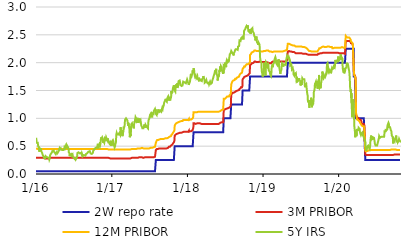
| Category | 2W repo rate | 3M PRIBOR | 12M PRIBOR | 5Y IRS |
|---|---|---|---|---|
| 2016-01-04 | 0.05 | 0.29 | 0.46 | 0.65 |
| 2016-01-05 | 0.05 | 0.29 | 0.46 | 0.63 |
| 2016-01-06 | 0.05 | 0.29 | 0.46 | 0.62 |
| 2016-01-07 | 0.05 | 0.29 | 0.46 | 0.56 |
| 2016-01-08 | 0.05 | 0.29 | 0.46 | 0.57 |
| 2016-01-11 | 0.05 | 0.29 | 0.45 | 0.56 |
| 2016-01-12 | 0.05 | 0.29 | 0.45 | 0.56 |
| 2016-01-13 | 0.05 | 0.29 | 0.45 | 0.56 |
| 2016-01-14 | 0.05 | 0.29 | 0.45 | 0.5 |
| 2016-01-15 | 0.05 | 0.29 | 0.45 | 0.49 |
| 2016-01-18 | 0.05 | 0.29 | 0.45 | 0.46 |
| 2016-01-19 | 0.05 | 0.29 | 0.45 | 0.46 |
| 2016-01-20 | 0.05 | 0.29 | 0.45 | 0.4 |
| 2016-01-21 | 0.05 | 0.29 | 0.45 | 0.43 |
| 2016-01-22 | 0.05 | 0.29 | 0.45 | 0.46 |
| 2016-01-25 | 0.05 | 0.29 | 0.45 | 0.45 |
| 2016-01-26 | 0.05 | 0.29 | 0.45 | 0.44 |
| 2016-01-27 | 0.05 | 0.29 | 0.45 | 0.46 |
| 2016-01-28 | 0.05 | 0.29 | 0.45 | 0.44 |
| 2016-01-29 | 0.05 | 0.29 | 0.45 | 0.41 |
| 2016-02-01 | 0.05 | 0.29 | 0.45 | 0.4 |
| 2016-02-02 | 0.05 | 0.29 | 0.45 | 0.38 |
| 2016-02-03 | 0.05 | 0.29 | 0.45 | 0.37 |
| 2016-02-04 | 0.05 | 0.29 | 0.45 | 0.37 |
| 2016-02-05 | 0.05 | 0.29 | 0.45 | 0.34 |
| 2016-02-08 | 0.05 | 0.29 | 0.45 | 0.32 |
| 2016-02-09 | 0.05 | 0.28 | 0.45 | 0.31 |
| 2016-02-10 | 0.05 | 0.28 | 0.45 | 0.31 |
| 2016-02-11 | 0.05 | 0.28 | 0.45 | 0.29 |
| 2016-02-12 | 0.05 | 0.28 | 0.45 | 0.28 |
| 2016-02-15 | 0.05 | 0.28 | 0.45 | 0.28 |
| 2016-02-16 | 0.05 | 0.28 | 0.45 | 0.28 |
| 2016-02-17 | 0.05 | 0.28 | 0.45 | 0.28 |
| 2016-02-18 | 0.05 | 0.28 | 0.45 | 0.3 |
| 2016-02-19 | 0.05 | 0.28 | 0.45 | 0.32 |
| 2016-02-22 | 0.05 | 0.28 | 0.45 | 0.32 |
| 2016-02-23 | 0.05 | 0.28 | 0.45 | 0.32 |
| 2016-02-24 | 0.05 | 0.28 | 0.45 | 0.3 |
| 2016-02-25 | 0.05 | 0.28 | 0.45 | 0.3 |
| 2016-02-26 | 0.05 | 0.28 | 0.45 | 0.31 |
| 2016-02-29 | 0.05 | 0.28 | 0.45 | 0.3 |
| 2016-03-01 | 0.05 | 0.28 | 0.45 | 0.29 |
| 2016-03-02 | 0.05 | 0.28 | 0.45 | 0.31 |
| 2016-03-03 | 0.05 | 0.28 | 0.45 | 0.3 |
| 2016-03-04 | 0.05 | 0.28 | 0.45 | 0.29 |
| 2016-03-07 | 0.05 | 0.28 | 0.45 | 0.28 |
| 2016-03-08 | 0.05 | 0.28 | 0.45 | 0.26 |
| 2016-03-09 | 0.05 | 0.28 | 0.45 | 0.26 |
| 2016-03-10 | 0.05 | 0.28 | 0.45 | 0.28 |
| 2016-03-11 | 0.05 | 0.29 | 0.45 | 0.33 |
| 2016-03-14 | 0.05 | 0.29 | 0.45 | 0.34 |
| 2016-03-15 | 0.05 | 0.29 | 0.45 | 0.36 |
| 2016-03-16 | 0.05 | 0.29 | 0.45 | 0.37 |
| 2016-03-17 | 0.05 | 0.29 | 0.45 | 0.37 |
| 2016-03-18 | 0.05 | 0.29 | 0.45 | 0.37 |
| 2016-03-21 | 0.05 | 0.29 | 0.45 | 0.39 |
| 2016-03-22 | 0.05 | 0.29 | 0.45 | 0.41 |
| 2016-03-23 | 0.05 | 0.29 | 0.45 | 0.41 |
| 2016-03-24 | 0.05 | 0.29 | 0.45 | 0.4 |
| 2016-03-29 | 0.05 | 0.29 | 0.45 | 0.42 |
| 2016-03-30 | 0.05 | 0.29 | 0.45 | 0.4 |
| 2016-03-31 | 0.05 | 0.29 | 0.45 | 0.4 |
| 2016-04-01 | 0.05 | 0.29 | 0.45 | 0.4 |
| 2016-04-04 | 0.05 | 0.29 | 0.45 | 0.38 |
| 2016-04-05 | 0.05 | 0.29 | 0.45 | 0.37 |
| 2016-04-06 | 0.05 | 0.29 | 0.45 | 0.38 |
| 2016-04-07 | 0.05 | 0.29 | 0.45 | 0.36 |
| 2016-04-08 | 0.05 | 0.29 | 0.45 | 0.36 |
| 2016-04-11 | 0.05 | 0.29 | 0.45 | 0.35 |
| 2016-04-12 | 0.05 | 0.29 | 0.45 | 0.39 |
| 2016-04-13 | 0.05 | 0.29 | 0.45 | 0.37 |
| 2016-04-14 | 0.05 | 0.29 | 0.45 | 0.39 |
| 2016-04-15 | 0.05 | 0.29 | 0.45 | 0.37 |
| 2016-04-18 | 0.05 | 0.29 | 0.45 | 0.37 |
| 2016-04-19 | 0.05 | 0.29 | 0.45 | 0.39 |
| 2016-04-20 | 0.05 | 0.29 | 0.45 | 0.38 |
| 2016-04-21 | 0.05 | 0.29 | 0.45 | 0.41 |
| 2016-04-22 | 0.05 | 0.29 | 0.45 | 0.41 |
| 2016-04-25 | 0.05 | 0.29 | 0.45 | 0.42 |
| 2016-04-26 | 0.05 | 0.29 | 0.45 | 0.46 |
| 2016-04-27 | 0.05 | 0.29 | 0.45 | 0.46 |
| 2016-04-28 | 0.05 | 0.29 | 0.45 | 0.44 |
| 2016-04-29 | 0.05 | 0.29 | 0.45 | 0.45 |
| 2016-05-02 | 0.05 | 0.29 | 0.45 | 0.46 |
| 2016-05-03 | 0.05 | 0.29 | 0.45 | 0.46 |
| 2016-05-04 | 0.05 | 0.29 | 0.45 | 0.44 |
| 2016-05-05 | 0.05 | 0.29 | 0.45 | 0.45 |
| 2016-05-06 | 0.05 | 0.29 | 0.45 | 0.44 |
| 2016-05-09 | 0.05 | 0.29 | 0.45 | 0.43 |
| 2016-05-10 | 0.05 | 0.29 | 0.45 | 0.44 |
| 2016-05-11 | 0.05 | 0.29 | 0.45 | 0.43 |
| 2016-05-12 | 0.05 | 0.29 | 0.45 | 0.42 |
| 2016-05-13 | 0.05 | 0.29 | 0.45 | 0.43 |
| 2016-05-16 | 0.05 | 0.29 | 0.45 | 0.43 |
| 2016-05-17 | 0.05 | 0.29 | 0.45 | 0.44 |
| 2016-05-18 | 0.05 | 0.29 | 0.45 | 0.44 |
| 2016-05-19 | 0.05 | 0.29 | 0.45 | 0.46 |
| 2016-05-20 | 0.05 | 0.29 | 0.45 | 0.48 |
| 2016-05-23 | 0.05 | 0.29 | 0.45 | 0.46 |
| 2016-05-24 | 0.05 | 0.29 | 0.45 | 0.46 |
| 2016-05-25 | 0.05 | 0.29 | 0.45 | 0.48 |
| 2016-05-26 | 0.05 | 0.29 | 0.45 | 0.48 |
| 2016-05-27 | 0.05 | 0.29 | 0.45 | 0.51 |
| 2016-05-30 | 0.05 | 0.29 | 0.45 | 0.49 |
| 2016-05-31 | 0.05 | 0.29 | 0.45 | 0.52 |
| 2016-06-01 | 0.05 | 0.29 | 0.45 | 0.51 |
| 2016-06-02 | 0.05 | 0.29 | 0.45 | 0.51 |
| 2016-06-03 | 0.05 | 0.29 | 0.45 | 0.51 |
| 2016-06-06 | 0.05 | 0.29 | 0.45 | 0.48 |
| 2016-06-07 | 0.05 | 0.29 | 0.45 | 0.49 |
| 2016-06-08 | 0.05 | 0.29 | 0.45 | 0.47 |
| 2016-06-09 | 0.05 | 0.29 | 0.45 | 0.45 |
| 2016-06-10 | 0.05 | 0.29 | 0.45 | 0.39 |
| 2016-06-13 | 0.05 | 0.29 | 0.45 | 0.37 |
| 2016-06-14 | 0.05 | 0.29 | 0.45 | 0.32 |
| 2016-06-15 | 0.05 | 0.29 | 0.45 | 0.32 |
| 2016-06-16 | 0.05 | 0.29 | 0.45 | 0.32 |
| 2016-06-17 | 0.05 | 0.29 | 0.45 | 0.35 |
| 2016-06-20 | 0.05 | 0.29 | 0.45 | 0.35 |
| 2016-06-21 | 0.05 | 0.29 | 0.45 | 0.36 |
| 2016-06-22 | 0.05 | 0.29 | 0.45 | 0.36 |
| 2016-06-23 | 0.05 | 0.29 | 0.45 | 0.36 |
| 2016-06-24 | 0.05 | 0.29 | 0.45 | 0.33 |
| 2016-06-27 | 0.05 | 0.29 | 0.45 | 0.32 |
| 2016-06-28 | 0.05 | 0.29 | 0.45 | 0.35 |
| 2016-06-29 | 0.05 | 0.29 | 0.45 | 0.33 |
| 2016-06-30 | 0.05 | 0.29 | 0.45 | 0.31 |
| 2016-07-01 | 0.05 | 0.29 | 0.45 | 0.31 |
| 2016-07-04 | 0.05 | 0.29 | 0.45 | 0.29 |
| 2016-07-07 | 0.05 | 0.29 | 0.45 | 0.28 |
| 2016-07-08 | 0.05 | 0.29 | 0.45 | 0.28 |
| 2016-07-11 | 0.05 | 0.29 | 0.45 | 0.26 |
| 2016-07-12 | 0.05 | 0.29 | 0.45 | 0.3 |
| 2016-07-13 | 0.05 | 0.29 | 0.45 | 0.29 |
| 2016-07-14 | 0.05 | 0.29 | 0.45 | 0.27 |
| 2016-07-15 | 0.05 | 0.29 | 0.45 | 0.28 |
| 2016-07-18 | 0.05 | 0.29 | 0.45 | 0.29 |
| 2016-07-19 | 0.05 | 0.29 | 0.45 | 0.28 |
| 2016-07-20 | 0.05 | 0.29 | 0.45 | 0.32 |
| 2016-07-21 | 0.05 | 0.29 | 0.45 | 0.36 |
| 2016-07-22 | 0.05 | 0.29 | 0.45 | 0.38 |
| 2016-07-25 | 0.05 | 0.29 | 0.45 | 0.38 |
| 2016-07-26 | 0.05 | 0.29 | 0.45 | 0.38 |
| 2016-07-27 | 0.05 | 0.29 | 0.45 | 0.39 |
| 2016-07-28 | 0.05 | 0.29 | 0.45 | 0.38 |
| 2016-07-29 | 0.05 | 0.29 | 0.45 | 0.38 |
| 2016-08-01 | 0.05 | 0.29 | 0.45 | 0.37 |
| 2016-08-02 | 0.05 | 0.29 | 0.45 | 0.37 |
| 2016-08-03 | 0.05 | 0.29 | 0.45 | 0.37 |
| 2016-08-04 | 0.05 | 0.29 | 0.45 | 0.38 |
| 2016-08-05 | 0.05 | 0.29 | 0.45 | 0.38 |
| 2016-08-08 | 0.05 | 0.29 | 0.45 | 0.38 |
| 2016-08-09 | 0.05 | 0.29 | 0.45 | 0.37 |
| 2016-08-10 | 0.05 | 0.29 | 0.45 | 0.37 |
| 2016-08-11 | 0.05 | 0.29 | 0.45 | 0.35 |
| 2016-08-12 | 0.05 | 0.29 | 0.45 | 0.37 |
| 2016-08-15 | 0.05 | 0.29 | 0.45 | 0.34 |
| 2016-08-16 | 0.05 | 0.29 | 0.45 | 0.32 |
| 2016-08-17 | 0.05 | 0.29 | 0.45 | 0.33 |
| 2016-08-18 | 0.05 | 0.29 | 0.45 | 0.33 |
| 2016-08-19 | 0.05 | 0.29 | 0.45 | 0.33 |
| 2016-08-22 | 0.05 | 0.29 | 0.45 | 0.34 |
| 2016-08-23 | 0.05 | 0.29 | 0.45 | 0.33 |
| 2016-08-24 | 0.05 | 0.29 | 0.45 | 0.33 |
| 2016-08-25 | 0.05 | 0.29 | 0.45 | 0.33 |
| 2016-08-26 | 0.05 | 0.29 | 0.45 | 0.33 |
| 2016-08-29 | 0.05 | 0.29 | 0.45 | 0.33 |
| 2016-08-30 | 0.05 | 0.29 | 0.45 | 0.33 |
| 2016-08-31 | 0.05 | 0.29 | 0.45 | 0.34 |
| 2016-09-01 | 0.05 | 0.29 | 0.45 | 0.36 |
| 2016-09-02 | 0.05 | 0.29 | 0.45 | 0.36 |
| 2016-09-05 | 0.05 | 0.29 | 0.45 | 0.37 |
| 2016-09-06 | 0.05 | 0.29 | 0.45 | 0.37 |
| 2016-09-07 | 0.05 | 0.29 | 0.45 | 0.36 |
| 2016-09-08 | 0.05 | 0.29 | 0.45 | 0.36 |
| 2016-09-09 | 0.05 | 0.29 | 0.45 | 0.38 |
| 2016-09-12 | 0.05 | 0.29 | 0.45 | 0.4 |
| 2016-09-13 | 0.05 | 0.29 | 0.45 | 0.4 |
| 2016-09-14 | 0.05 | 0.29 | 0.45 | 0.4 |
| 2016-09-15 | 0.05 | 0.29 | 0.45 | 0.41 |
| 2016-09-16 | 0.05 | 0.29 | 0.45 | 0.41 |
| 2016-09-19 | 0.05 | 0.29 | 0.45 | 0.41 |
| 2016-09-20 | 0.05 | 0.29 | 0.45 | 0.41 |
| 2016-09-21 | 0.05 | 0.29 | 0.45 | 0.39 |
| 2016-09-22 | 0.05 | 0.29 | 0.45 | 0.38 |
| 2016-09-23 | 0.05 | 0.29 | 0.45 | 0.37 |
| 2016-09-26 | 0.05 | 0.29 | 0.45 | 0.36 |
| 2016-09-27 | 0.05 | 0.29 | 0.45 | 0.36 |
| 2016-09-29 | 0.05 | 0.29 | 0.45 | 0.36 |
| 2016-09-30 | 0.05 | 0.29 | 0.45 | 0.36 |
| 2016-10-03 | 0.05 | 0.29 | 0.45 | 0.37 |
| 2016-10-04 | 0.05 | 0.29 | 0.45 | 0.38 |
| 2016-10-05 | 0.05 | 0.29 | 0.45 | 0.39 |
| 2016-10-06 | 0.05 | 0.29 | 0.45 | 0.42 |
| 2016-10-07 | 0.05 | 0.29 | 0.45 | 0.42 |
| 2016-10-10 | 0.05 | 0.29 | 0.45 | 0.43 |
| 2016-10-11 | 0.05 | 0.29 | 0.45 | 0.44 |
| 2016-10-12 | 0.05 | 0.29 | 0.45 | 0.44 |
| 2016-10-13 | 0.05 | 0.29 | 0.45 | 0.45 |
| 2016-10-14 | 0.05 | 0.29 | 0.45 | 0.45 |
| 2016-10-17 | 0.05 | 0.29 | 0.45 | 0.47 |
| 2016-10-18 | 0.05 | 0.29 | 0.45 | 0.47 |
| 2016-10-19 | 0.05 | 0.29 | 0.45 | 0.47 |
| 2016-10-20 | 0.05 | 0.29 | 0.45 | 0.48 |
| 2016-10-21 | 0.05 | 0.29 | 0.45 | 0.48 |
| 2016-10-24 | 0.05 | 0.29 | 0.45 | 0.48 |
| 2016-10-25 | 0.05 | 0.29 | 0.45 | 0.46 |
| 2016-10-26 | 0.05 | 0.29 | 0.45 | 0.48 |
| 2016-10-27 | 0.05 | 0.29 | 0.45 | 0.53 |
| 2016-10-31 | 0.05 | 0.29 | 0.45 | 0.54 |
| 2016-11-01 | 0.05 | 0.29 | 0.45 | 0.53 |
| 2016-11-02 | 0.05 | 0.29 | 0.45 | 0.51 |
| 2016-11-03 | 0.05 | 0.29 | 0.45 | 0.52 |
| 2016-11-04 | 0.05 | 0.29 | 0.45 | 0.53 |
| 2016-11-07 | 0.05 | 0.29 | 0.45 | 0.5 |
| 2016-11-08 | 0.05 | 0.29 | 0.45 | 0.49 |
| 2016-11-09 | 0.05 | 0.29 | 0.45 | 0.51 |
| 2016-11-10 | 0.05 | 0.29 | 0.45 | 0.55 |
| 2016-11-11 | 0.05 | 0.29 | 0.45 | 0.61 |
| 2016-11-14 | 0.05 | 0.29 | 0.45 | 0.66 |
| 2016-11-15 | 0.05 | 0.29 | 0.45 | 0.64 |
| 2016-11-16 | 0.05 | 0.29 | 0.45 | 0.65 |
| 2016-11-18 | 0.05 | 0.29 | 0.45 | 0.66 |
| 2016-11-21 | 0.05 | 0.29 | 0.45 | 0.63 |
| 2016-11-22 | 0.05 | 0.29 | 0.45 | 0.6 |
| 2016-11-23 | 0.05 | 0.29 | 0.45 | 0.56 |
| 2016-11-24 | 0.05 | 0.29 | 0.45 | 0.59 |
| 2016-11-25 | 0.05 | 0.29 | 0.45 | 0.59 |
| 2016-11-28 | 0.05 | 0.29 | 0.45 | 0.56 |
| 2016-11-29 | 0.05 | 0.29 | 0.45 | 0.56 |
| 2016-11-30 | 0.05 | 0.29 | 0.45 | 0.57 |
| 2016-12-01 | 0.05 | 0.29 | 0.45 | 0.64 |
| 2016-12-02 | 0.05 | 0.29 | 0.45 | 0.63 |
| 2016-12-05 | 0.05 | 0.29 | 0.45 | 0.62 |
| 2016-12-06 | 0.05 | 0.29 | 0.45 | 0.64 |
| 2016-12-07 | 0.05 | 0.29 | 0.45 | 0.66 |
| 2016-12-08 | 0.05 | 0.29 | 0.45 | 0.66 |
| 2016-12-09 | 0.05 | 0.29 | 0.45 | 0.64 |
| 2016-12-12 | 0.05 | 0.29 | 0.45 | 0.65 |
| 2016-12-13 | 0.05 | 0.29 | 0.45 | 0.63 |
| 2016-12-14 | 0.05 | 0.29 | 0.45 | 0.6 |
| 2016-12-15 | 0.05 | 0.29 | 0.45 | 0.64 |
| 2016-12-16 | 0.05 | 0.29 | 0.45 | 0.62 |
| 2016-12-19 | 0.05 | 0.29 | 0.44 | 0.59 |
| 2016-12-20 | 0.05 | 0.29 | 0.44 | 0.57 |
| 2016-12-21 | 0.05 | 0.29 | 0.44 | 0.56 |
| 2016-12-22 | 0.05 | 0.28 | 0.44 | 0.57 |
| 2016-12-23 | 0.05 | 0.28 | 0.44 | 0.55 |
| 2016-12-27 | 0.05 | 0.28 | 0.44 | 0.57 |
| 2016-12-28 | 0.05 | 0.27 | 0.43 | 0.54 |
| 2016-12-29 | 0.05 | 0.28 | 0.44 | 0.52 |
| 2016-12-30 | 0.05 | 0.28 | 0.44 | 0.52 |
| 2017-01-02 | 0.05 | 0.28 | 0.44 | 0.52 |
| 2017-01-03 | 0.05 | 0.28 | 0.44 | 0.52 |
| 2017-01-04 | 0.05 | 0.28 | 0.44 | 0.57 |
| 2017-01-05 | 0.05 | 0.28 | 0.44 | 0.59 |
| 2017-01-06 | 0.05 | 0.28 | 0.44 | 0.58 |
| 2017-01-09 | 0.05 | 0.28 | 0.44 | 0.61 |
| 2017-01-10 | 0.05 | 0.28 | 0.44 | 0.6 |
| 2017-01-11 | 0.05 | 0.28 | 0.44 | 0.59 |
| 2017-01-12 | 0.05 | 0.28 | 0.44 | 0.56 |
| 2017-01-13 | 0.05 | 0.28 | 0.44 | 0.52 |
| 2017-01-16 | 0.05 | 0.28 | 0.44 | 0.5 |
| 2017-01-17 | 0.05 | 0.28 | 0.44 | 0.48 |
| 2017-01-18 | 0.05 | 0.28 | 0.44 | 0.48 |
| 2017-01-19 | 0.05 | 0.28 | 0.44 | 0.5 |
| 2017-01-20 | 0.05 | 0.28 | 0.44 | 0.53 |
| 2017-01-23 | 0.05 | 0.28 | 0.44 | 0.56 |
| 2017-01-24 | 0.05 | 0.28 | 0.44 | 0.62 |
| 2017-01-25 | 0.05 | 0.28 | 0.44 | 0.7 |
| 2017-01-26 | 0.05 | 0.28 | 0.44 | 0.7 |
| 2017-01-27 | 0.05 | 0.28 | 0.44 | 0.74 |
| 2017-01-30 | 0.05 | 0.28 | 0.44 | 0.71 |
| 2017-01-31 | 0.05 | 0.28 | 0.44 | 0.71 |
| 2017-02-01 | 0.05 | 0.28 | 0.44 | 0.7 |
| 2017-02-02 | 0.05 | 0.28 | 0.44 | 0.72 |
| 2017-02-03 | 0.05 | 0.28 | 0.44 | 0.71 |
| 2017-02-06 | 0.05 | 0.28 | 0.44 | 0.71 |
| 2017-02-07 | 0.05 | 0.28 | 0.44 | 0.74 |
| 2017-02-08 | 0.05 | 0.28 | 0.44 | 0.75 |
| 2017-02-09 | 0.05 | 0.28 | 0.44 | 0.7 |
| 2017-02-10 | 0.05 | 0.28 | 0.44 | 0.72 |
| 2017-02-13 | 0.05 | 0.28 | 0.44 | 0.7 |
| 2017-02-14 | 0.05 | 0.28 | 0.44 | 0.77 |
| 2017-02-15 | 0.05 | 0.28 | 0.44 | 0.84 |
| 2017-02-16 | 0.05 | 0.28 | 0.44 | 0.83 |
| 2017-02-17 | 0.05 | 0.28 | 0.44 | 0.76 |
| 2017-02-20 | 0.05 | 0.28 | 0.44 | 0.79 |
| 2017-02-21 | 0.05 | 0.28 | 0.44 | 0.8 |
| 2017-02-22 | 0.05 | 0.28 | 0.44 | 0.78 |
| 2017-02-23 | 0.05 | 0.28 | 0.44 | 0.7 |
| 2017-02-24 | 0.05 | 0.28 | 0.44 | 0.68 |
| 2017-02-27 | 0.05 | 0.28 | 0.44 | 0.68 |
| 2017-02-28 | 0.05 | 0.28 | 0.44 | 0.77 |
| 2017-03-01 | 0.05 | 0.28 | 0.44 | 0.77 |
| 2017-03-02 | 0.05 | 0.28 | 0.44 | 0.85 |
| 2017-03-03 | 0.05 | 0.28 | 0.44 | 0.83 |
| 2017-03-06 | 0.05 | 0.28 | 0.44 | 0.86 |
| 2017-03-07 | 0.05 | 0.28 | 0.44 | 0.87 |
| 2017-03-08 | 0.05 | 0.28 | 0.44 | 0.96 |
| 2017-03-09 | 0.05 | 0.28 | 0.44 | 0.98 |
| 2017-03-10 | 0.05 | 0.28 | 0.44 | 0.99 |
| 2017-03-13 | 0.05 | 0.28 | 0.44 | 1 |
| 2017-03-14 | 0.05 | 0.28 | 0.44 | 1 |
| 2017-03-15 | 0.05 | 0.28 | 0.44 | 0.99 |
| 2017-03-16 | 0.05 | 0.28 | 0.44 | 0.99 |
| 2017-03-17 | 0.05 | 0.28 | 0.44 | 0.99 |
| 2017-03-20 | 0.05 | 0.28 | 0.44 | 0.96 |
| 2017-03-21 | 0.05 | 0.28 | 0.44 | 0.97 |
| 2017-03-22 | 0.05 | 0.28 | 0.44 | 0.9 |
| 2017-03-23 | 0.05 | 0.28 | 0.44 | 0.87 |
| 2017-03-24 | 0.05 | 0.28 | 0.44 | 0.92 |
| 2017-03-27 | 0.05 | 0.28 | 0.44 | 0.86 |
| 2017-03-28 | 0.05 | 0.28 | 0.44 | 0.84 |
| 2017-03-29 | 0.05 | 0.28 | 0.44 | 0.84 |
| 2017-03-30 | 0.05 | 0.28 | 0.44 | 0.8 |
| 2017-03-31 | 0.05 | 0.28 | 0.44 | 0.66 |
| 2017-04-03 | 0.05 | 0.28 | 0.44 | 0.71 |
| 2017-04-04 | 0.05 | 0.28 | 0.44 | 0.68 |
| 2017-04-05 | 0.05 | 0.28 | 0.44 | 0.73 |
| 2017-04-06 | 0.05 | 0.28 | 0.44 | 0.76 |
| 2017-04-07 | 0.05 | 0.29 | 0.44 | 0.89 |
| 2017-04-10 | 0.05 | 0.29 | 0.45 | 0.89 |
| 2017-04-11 | 0.05 | 0.29 | 0.45 | 0.91 |
| 2017-04-12 | 0.05 | 0.29 | 0.45 | 0.89 |
| 2017-04-13 | 0.05 | 0.29 | 0.45 | 0.88 |
| 2017-04-18 | 0.05 | 0.29 | 0.45 | 0.85 |
| 2017-04-19 | 0.05 | 0.29 | 0.45 | 0.82 |
| 2017-04-20 | 0.05 | 0.29 | 0.45 | 0.87 |
| 2017-04-21 | 0.05 | 0.29 | 0.45 | 0.88 |
| 2017-04-24 | 0.05 | 0.29 | 0.45 | 0.95 |
| 2017-04-25 | 0.05 | 0.29 | 0.45 | 0.93 |
| 2017-04-26 | 0.05 | 0.29 | 0.45 | 0.94 |
| 2017-04-27 | 0.05 | 0.29 | 0.45 | 0.99 |
| 2017-04-28 | 0.05 | 0.29 | 0.45 | 1.02 |
| 2017-05-02 | 0.05 | 0.29 | 0.45 | 1.02 |
| 2017-05-03 | 0.05 | 0.29 | 0.45 | 0.98 |
| 2017-05-04 | 0.05 | 0.29 | 0.45 | 1.01 |
| 2017-05-05 | 0.05 | 0.29 | 0.45 | 0.95 |
| 2017-05-09 | 0.05 | 0.29 | 0.46 | 0.97 |
| 2017-05-10 | 0.05 | 0.29 | 0.46 | 0.92 |
| 2017-05-11 | 0.05 | 0.3 | 0.46 | 0.94 |
| 2017-05-12 | 0.05 | 0.3 | 0.46 | 0.96 |
| 2017-05-15 | 0.05 | 0.3 | 0.46 | 0.96 |
| 2017-05-16 | 0.05 | 0.3 | 0.46 | 1 |
| 2017-05-17 | 0.05 | 0.3 | 0.46 | 0.97 |
| 2017-05-18 | 0.05 | 0.3 | 0.46 | 0.95 |
| 2017-05-19 | 0.05 | 0.3 | 0.46 | 0.96 |
| 2017-05-22 | 0.05 | 0.3 | 0.46 | 0.97 |
| 2017-05-23 | 0.05 | 0.3 | 0.46 | 0.94 |
| 2017-05-24 | 0.05 | 0.3 | 0.47 | 0.92 |
| 2017-05-25 | 0.05 | 0.3 | 0.47 | 0.89 |
| 2017-05-26 | 0.05 | 0.3 | 0.47 | 0.87 |
| 2017-05-29 | 0.05 | 0.3 | 0.47 | 0.87 |
| 2017-05-30 | 0.05 | 0.3 | 0.46 | 0.84 |
| 2017-05-31 | 0.05 | 0.3 | 0.46 | 0.82 |
| 2017-06-01 | 0.05 | 0.3 | 0.46 | 0.81 |
| 2017-06-02 | 0.05 | 0.29 | 0.46 | 0.81 |
| 2017-06-05 | 0.05 | 0.29 | 0.46 | 0.82 |
| 2017-06-06 | 0.05 | 0.29 | 0.46 | 0.82 |
| 2017-06-07 | 0.05 | 0.29 | 0.46 | 0.81 |
| 2017-06-08 | 0.05 | 0.29 | 0.46 | 0.85 |
| 2017-06-09 | 0.05 | 0.3 | 0.46 | 0.89 |
| 2017-06-12 | 0.05 | 0.3 | 0.46 | 0.86 |
| 2017-06-13 | 0.05 | 0.3 | 0.46 | 0.87 |
| 2017-06-14 | 0.05 | 0.3 | 0.46 | 0.87 |
| 2017-06-15 | 0.05 | 0.3 | 0.46 | 0.83 |
| 2017-06-16 | 0.05 | 0.3 | 0.46 | 0.88 |
| 2017-06-19 | 0.05 | 0.3 | 0.46 | 0.86 |
| 2017-06-20 | 0.05 | 0.3 | 0.46 | 0.86 |
| 2017-06-21 | 0.05 | 0.3 | 0.46 | 0.86 |
| 2017-06-22 | 0.05 | 0.3 | 0.46 | 0.86 |
| 2017-06-23 | 0.05 | 0.3 | 0.46 | 0.84 |
| 2017-06-26 | 0.05 | 0.3 | 0.46 | 0.83 |
| 2017-06-27 | 0.05 | 0.3 | 0.46 | 0.82 |
| 2017-06-28 | 0.05 | 0.3 | 0.46 | 0.89 |
| 2017-06-29 | 0.05 | 0.29 | 0.46 | 0.94 |
| 2017-06-30 | 0.05 | 0.3 | 0.46 | 0.97 |
| 2017-07-03 | 0.05 | 0.3 | 0.46 | 0.99 |
| 2017-07-04 | 0.05 | 0.3 | 0.46 | 0.98 |
| 2017-07-07 | 0.05 | 0.3 | 0.47 | 1.06 |
| 2017-07-10 | 0.05 | 0.3 | 0.47 | 1.08 |
| 2017-07-11 | 0.05 | 0.3 | 0.47 | 1.05 |
| 2017-07-12 | 0.05 | 0.3 | 0.47 | 1.05 |
| 2017-07-13 | 0.05 | 0.3 | 0.47 | 1.03 |
| 2017-07-14 | 0.05 | 0.3 | 0.47 | 1.03 |
| 2017-07-17 | 0.05 | 0.3 | 0.47 | 1.03 |
| 2017-07-18 | 0.05 | 0.3 | 0.47 | 1.03 |
| 2017-07-19 | 0.05 | 0.3 | 0.47 | 1.09 |
| 2017-07-20 | 0.05 | 0.3 | 0.48 | 1.1 |
| 2017-07-21 | 0.05 | 0.3 | 0.48 | 1.08 |
| 2017-07-24 | 0.05 | 0.3 | 0.48 | 1.08 |
| 2017-07-25 | 0.05 | 0.3 | 0.48 | 1.13 |
| 2017-07-26 | 0.05 | 0.3 | 0.48 | 1.14 |
| 2017-07-27 | 0.05 | 0.3 | 0.48 | 1.14 |
| 2017-07-28 | 0.05 | 0.31 | 0.48 | 1.15 |
| 2017-07-31 | 0.05 | 0.31 | 0.49 | 1.17 |
| 2017-08-01 | 0.05 | 0.31 | 0.49 | 1.18 |
| 2017-08-02 | 0.05 | 0.31 | 0.49 | 1.14 |
| 2017-08-03 | 0.05 | 0.31 | 0.49 | 1.16 |
| 2017-08-04 | 0.25 | 0.43 | 0.56 | 1.08 |
| 2017-08-07 | 0.25 | 0.44 | 0.59 | 1.07 |
| 2017-08-08 | 0.25 | 0.44 | 0.6 | 1.06 |
| 2017-08-09 | 0.25 | 0.45 | 0.6 | 1.09 |
| 2017-08-10 | 0.25 | 0.45 | 0.61 | 1.07 |
| 2017-08-11 | 0.25 | 0.45 | 0.61 | 1.09 |
| 2017-08-14 | 0.25 | 0.45 | 0.61 | 1.11 |
| 2017-08-15 | 0.25 | 0.45 | 0.61 | 1.11 |
| 2017-08-16 | 0.25 | 0.45 | 0.62 | 1.16 |
| 2017-08-17 | 0.25 | 0.46 | 0.62 | 1.14 |
| 2017-08-18 | 0.25 | 0.46 | 0.62 | 1.14 |
| 2017-08-21 | 0.25 | 0.46 | 0.62 | 1.14 |
| 2017-08-22 | 0.25 | 0.46 | 0.63 | 1.12 |
| 2017-08-23 | 0.25 | 0.46 | 0.63 | 1.13 |
| 2017-08-24 | 0.25 | 0.46 | 0.63 | 1.13 |
| 2017-08-25 | 0.25 | 0.46 | 0.63 | 1.14 |
| 2017-08-28 | 0.25 | 0.46 | 0.63 | 1.14 |
| 2017-08-29 | 0.25 | 0.46 | 0.63 | 1.14 |
| 2017-08-30 | 0.25 | 0.46 | 0.63 | 1.12 |
| 2017-08-31 | 0.25 | 0.46 | 0.63 | 1.14 |
| 2017-09-01 | 0.25 | 0.46 | 0.63 | 1.15 |
| 2017-09-04 | 0.25 | 0.46 | 0.63 | 1.19 |
| 2017-09-05 | 0.25 | 0.46 | 0.63 | 1.19 |
| 2017-09-06 | 0.25 | 0.46 | 0.63 | 1.17 |
| 2017-09-07 | 0.25 | 0.46 | 0.63 | 1.19 |
| 2017-09-08 | 0.25 | 0.46 | 0.63 | 1.2 |
| 2017-09-11 | 0.25 | 0.46 | 0.63 | 1.23 |
| 2017-09-12 | 0.25 | 0.46 | 0.64 | 1.24 |
| 2017-09-13 | 0.25 | 0.46 | 0.64 | 1.28 |
| 2017-09-14 | 0.25 | 0.46 | 0.64 | 1.28 |
| 2017-09-15 | 0.25 | 0.46 | 0.64 | 1.3 |
| 2017-09-18 | 0.25 | 0.46 | 0.64 | 1.3 |
| 2017-09-19 | 0.25 | 0.46 | 0.64 | 1.33 |
| 2017-09-20 | 0.25 | 0.46 | 0.64 | 1.32 |
| 2017-09-21 | 0.25 | 0.46 | 0.64 | 1.35 |
| 2017-09-22 | 0.25 | 0.46 | 0.64 | 1.32 |
| 2017-09-25 | 0.25 | 0.46 | 0.64 | 1.31 |
| 2017-09-26 | 0.25 | 0.46 | 0.64 | 1.3 |
| 2017-09-27 | 0.25 | 0.47 | 0.64 | 1.33 |
| 2017-09-29 | 0.25 | 0.47 | 0.65 | 1.37 |
| 2017-10-02 | 0.25 | 0.47 | 0.65 | 1.39 |
| 2017-10-03 | 0.25 | 0.47 | 0.65 | 1.39 |
| 2017-10-04 | 0.25 | 0.47 | 0.65 | 1.36 |
| 2017-10-05 | 0.25 | 0.48 | 0.66 | 1.32 |
| 2017-10-06 | 0.25 | 0.49 | 0.66 | 1.38 |
| 2017-10-09 | 0.25 | 0.49 | 0.67 | 1.36 |
| 2017-10-10 | 0.25 | 0.49 | 0.67 | 1.35 |
| 2017-10-11 | 0.25 | 0.49 | 0.66 | 1.37 |
| 2017-10-12 | 0.25 | 0.49 | 0.66 | 1.32 |
| 2017-10-13 | 0.25 | 0.5 | 0.67 | 1.35 |
| 2017-10-16 | 0.25 | 0.51 | 0.68 | 1.37 |
| 2017-10-17 | 0.25 | 0.51 | 0.69 | 1.4 |
| 2017-10-18 | 0.25 | 0.52 | 0.7 | 1.49 |
| 2017-10-19 | 0.25 | 0.52 | 0.71 | 1.45 |
| 2017-10-20 | 0.25 | 0.52 | 0.71 | 1.46 |
| 2017-10-23 | 0.25 | 0.53 | 0.72 | 1.47 |
| 2017-10-24 | 0.25 | 0.54 | 0.72 | 1.47 |
| 2017-10-25 | 0.25 | 0.54 | 0.73 | 1.53 |
| 2017-10-26 | 0.25 | 0.55 | 0.74 | 1.55 |
| 2017-10-27 | 0.25 | 0.56 | 0.74 | 1.56 |
| 2017-10-30 | 0.25 | 0.57 | 0.75 | 1.59 |
| 2017-10-31 | 0.25 | 0.58 | 0.77 | 1.52 |
| 2017-11-01 | 0.25 | 0.59 | 0.77 | 1.53 |
| 2017-11-02 | 0.25 | 0.61 | 0.79 | 1.59 |
| 2017-11-03 | 0.5 | 0.69 | 0.87 | 1.5 |
| 2017-11-06 | 0.5 | 0.7 | 0.89 | 1.48 |
| 2017-11-07 | 0.5 | 0.7 | 0.89 | 1.53 |
| 2017-11-08 | 0.5 | 0.71 | 0.89 | 1.52 |
| 2017-11-09 | 0.5 | 0.72 | 0.9 | 1.57 |
| 2017-11-10 | 0.5 | 0.72 | 0.91 | 1.61 |
| 2017-11-13 | 0.5 | 0.72 | 0.91 | 1.56 |
| 2017-11-14 | 0.5 | 0.72 | 0.92 | 1.59 |
| 2017-11-15 | 0.5 | 0.72 | 0.92 | 1.55 |
| 2017-11-16 | 0.5 | 0.72 | 0.93 | 1.63 |
| 2017-11-20 | 0.5 | 0.73 | 0.93 | 1.6 |
| 2017-11-21 | 0.5 | 0.73 | 0.94 | 1.65 |
| 2017-11-22 | 0.5 | 0.73 | 0.94 | 1.67 |
| 2017-11-23 | 0.5 | 0.73 | 0.94 | 1.68 |
| 2017-11-24 | 0.5 | 0.74 | 0.94 | 1.68 |
| 2017-11-27 | 0.5 | 0.74 | 0.94 | 1.68 |
| 2017-11-28 | 0.5 | 0.74 | 0.94 | 1.68 |
| 2017-11-29 | 0.5 | 0.74 | 0.95 | 1.65 |
| 2017-11-30 | 0.5 | 0.74 | 0.95 | 1.66 |
| 2017-12-01 | 0.5 | 0.74 | 0.94 | 1.6 |
| 2017-12-04 | 0.5 | 0.74 | 0.95 | 1.6 |
| 2017-12-05 | 0.5 | 0.74 | 0.95 | 1.59 |
| 2017-12-06 | 0.5 | 0.74 | 0.95 | 1.58 |
| 2017-12-07 | 0.5 | 0.74 | 0.95 | 1.57 |
| 2017-12-08 | 0.5 | 0.75 | 0.95 | 1.57 |
| 2017-12-11 | 0.5 | 0.75 | 0.95 | 1.59 |
| 2017-12-12 | 0.5 | 0.75 | 0.95 | 1.59 |
| 2017-12-13 | 0.5 | 0.75 | 0.96 | 1.64 |
| 2017-12-14 | 0.5 | 0.76 | 0.97 | 1.66 |
| 2017-12-15 | 0.5 | 0.76 | 0.97 | 1.66 |
| 2017-12-18 | 0.5 | 0.76 | 0.97 | 1.66 |
| 2017-12-19 | 0.5 | 0.76 | 0.97 | 1.65 |
| 2017-12-20 | 0.5 | 0.76 | 0.97 | 1.66 |
| 2017-12-21 | 0.5 | 0.76 | 0.97 | 1.66 |
| 2017-12-22 | 0.5 | 0.76 | 0.97 | 1.66 |
| 2017-12-27 | 0.5 | 0.76 | 0.97 | 1.63 |
| 2017-12-28 | 0.5 | 0.76 | 0.97 | 1.64 |
| 2017-12-29 | 0.5 | 0.76 | 0.97 | 1.64 |
| 2018-01-02 | 0.5 | 0.76 | 0.97 | 1.7 |
| 2018-01-03 | 0.5 | 0.76 | 0.97 | 1.69 |
| 2018-01-04 | 0.5 | 0.76 | 0.97 | 1.68 |
| 2018-01-05 | 0.5 | 0.76 | 0.97 | 1.65 |
| 2018-01-08 | 0.5 | 0.76 | 0.97 | 1.63 |
| 2018-01-09 | 0.5 | 0.76 | 0.97 | 1.63 |
| 2018-01-10 | 0.5 | 0.76 | 0.97 | 1.6 |
| 2018-01-11 | 0.5 | 0.78 | 0.99 | 1.59 |
| 2018-01-12 | 0.5 | 0.76 | 0.97 | 1.63 |
| 2018-01-15 | 0.5 | 0.76 | 0.97 | 1.65 |
| 2018-01-16 | 0.5 | 0.76 | 0.97 | 1.66 |
| 2018-01-17 | 0.5 | 0.77 | 0.98 | 1.69 |
| 2018-01-18 | 0.5 | 0.77 | 0.98 | 1.75 |
| 2018-01-19 | 0.5 | 0.77 | 0.98 | 1.77 |
| 2018-01-22 | 0.5 | 0.77 | 0.98 | 1.77 |
| 2018-01-23 | 0.5 | 0.77 | 0.98 | 1.75 |
| 2018-01-24 | 0.5 | 0.77 | 0.98 | 1.75 |
| 2018-01-25 | 0.5 | 0.78 | 0.99 | 1.75 |
| 2018-01-26 | 0.5 | 0.78 | 0.99 | 1.79 |
| 2018-01-29 | 0.5 | 0.79 | 1 | 1.86 |
| 2018-01-30 | 0.5 | 0.81 | 1.01 | 1.84 |
| 2018-01-31 | 0.5 | 0.81 | 1.02 | 1.82 |
| 2018-02-01 | 0.5 | 0.83 | 1.03 | 1.86 |
| 2018-02-02 | 0.75 | 0.91 | 1.11 | 1.9 |
| 2018-02-05 | 0.75 | 0.91 | 1.11 | 1.86 |
| 2018-02-06 | 0.75 | 0.91 | 1.11 | 1.8 |
| 2018-02-07 | 0.75 | 0.91 | 1.11 | 1.79 |
| 2018-02-08 | 0.75 | 0.91 | 1.11 | 1.81 |
| 2018-02-09 | 0.75 | 0.9 | 1.11 | 1.75 |
| 2018-02-12 | 0.75 | 0.9 | 1.11 | 1.77 |
| 2018-02-13 | 0.75 | 0.9 | 1.11 | 1.75 |
| 2018-02-14 | 0.75 | 0.9 | 1.11 | 1.72 |
| 2018-02-15 | 0.75 | 0.9 | 1.11 | 1.76 |
| 2018-02-16 | 0.75 | 0.9 | 1.11 | 1.73 |
| 2018-02-19 | 0.75 | 0.91 | 1.11 | 1.72 |
| 2018-02-20 | 0.75 | 0.91 | 1.11 | 1.76 |
| 2018-02-21 | 0.75 | 0.91 | 1.11 | 1.73 |
| 2018-02-22 | 0.75 | 0.91 | 1.12 | 1.71 |
| 2018-02-23 | 0.75 | 0.91 | 1.12 | 1.71 |
| 2018-02-26 | 0.75 | 0.91 | 1.12 | 1.69 |
| 2018-02-27 | 0.75 | 0.91 | 1.12 | 1.71 |
| 2018-02-28 | 0.75 | 0.91 | 1.12 | 1.73 |
| 2018-03-01 | 0.75 | 0.91 | 1.12 | 1.7 |
| 2018-03-02 | 0.75 | 0.91 | 1.12 | 1.68 |
| 2018-03-05 | 0.75 | 0.91 | 1.12 | 1.67 |
| 2018-03-06 | 0.75 | 0.91 | 1.12 | 1.69 |
| 2018-03-07 | 0.75 | 0.91 | 1.12 | 1.69 |
| 2018-03-08 | 0.75 | 0.91 | 1.12 | 1.71 |
| 2018-03-09 | 0.75 | 0.9 | 1.12 | 1.68 |
| 2018-03-12 | 0.75 | 0.9 | 1.12 | 1.67 |
| 2018-03-13 | 0.75 | 0.9 | 1.12 | 1.67 |
| 2018-03-14 | 0.75 | 0.9 | 1.12 | 1.67 |
| 2018-03-15 | 0.75 | 0.9 | 1.12 | 1.7 |
| 2018-03-16 | 0.75 | 0.9 | 1.12 | 1.7 |
| 2018-03-19 | 0.75 | 0.9 | 1.12 | 1.71 |
| 2018-03-20 | 0.75 | 0.9 | 1.12 | 1.72 |
| 2018-03-21 | 0.75 | 0.9 | 1.12 | 1.76 |
| 2018-03-22 | 0.75 | 0.9 | 1.12 | 1.75 |
| 2018-03-23 | 0.75 | 0.9 | 1.12 | 1.73 |
| 2018-03-26 | 0.75 | 0.9 | 1.12 | 1.71 |
| 2018-03-27 | 0.75 | 0.9 | 1.12 | 1.69 |
| 2018-03-28 | 0.75 | 0.9 | 1.12 | 1.64 |
| 2018-03-29 | 0.75 | 0.9 | 1.12 | 1.65 |
| 2018-04-03 | 0.75 | 0.9 | 1.12 | 1.66 |
| 2018-04-04 | 0.75 | 0.9 | 1.12 | 1.66 |
| 2018-04-05 | 0.75 | 0.9 | 1.12 | 1.68 |
| 2018-04-06 | 0.75 | 0.9 | 1.12 | 1.66 |
| 2018-04-09 | 0.75 | 0.9 | 1.12 | 1.65 |
| 2018-04-10 | 0.75 | 0.9 | 1.12 | 1.65 |
| 2018-04-11 | 0.75 | 0.9 | 1.12 | 1.63 |
| 2018-04-12 | 0.75 | 0.9 | 1.12 | 1.62 |
| 2018-04-13 | 0.75 | 0.9 | 1.12 | 1.64 |
| 2018-04-16 | 0.75 | 0.9 | 1.12 | 1.64 |
| 2018-04-17 | 0.75 | 0.9 | 1.13 | 1.63 |
| 2018-04-18 | 0.75 | 0.9 | 1.12 | 1.61 |
| 2018-04-19 | 0.75 | 0.9 | 1.12 | 1.62 |
| 2018-04-20 | 0.75 | 0.9 | 1.12 | 1.63 |
| 2018-04-23 | 0.75 | 0.9 | 1.12 | 1.66 |
| 2018-04-24 | 0.75 | 0.9 | 1.12 | 1.65 |
| 2018-04-25 | 0.75 | 0.9 | 1.12 | 1.66 |
| 2018-04-26 | 0.75 | 0.9 | 1.12 | 1.66 |
| 2018-04-27 | 0.75 | 0.9 | 1.12 | 1.62 |
| 2018-04-30 | 0.75 | 0.9 | 1.12 | 1.62 |
| 2018-05-02 | 0.75 | 0.9 | 1.12 | 1.64 |
| 2018-05-03 | 0.75 | 0.9 | 1.12 | 1.67 |
| 2018-05-04 | 0.75 | 0.9 | 1.12 | 1.68 |
| 2018-05-07 | 0.75 | 0.9 | 1.12 | 1.68 |
| 2018-05-09 | 0.75 | 0.9 | 1.12 | 1.74 |
| 2018-05-10 | 0.75 | 0.9 | 1.12 | 1.76 |
| 2018-05-11 | 0.75 | 0.9 | 1.12 | 1.76 |
| 2018-05-14 | 0.75 | 0.9 | 1.12 | 1.8 |
| 2018-05-15 | 0.75 | 0.9 | 1.12 | 1.82 |
| 2018-05-16 | 0.75 | 0.9 | 1.12 | 1.84 |
| 2018-05-17 | 0.75 | 0.9 | 1.12 | 1.86 |
| 2018-05-18 | 0.75 | 0.9 | 1.12 | 1.84 |
| 2018-05-21 | 0.75 | 0.9 | 1.12 | 1.87 |
| 2018-05-22 | 0.75 | 0.9 | 1.12 | 1.89 |
| 2018-05-23 | 0.75 | 0.9 | 1.12 | 1.85 |
| 2018-05-24 | 0.75 | 0.9 | 1.12 | 1.82 |
| 2018-05-25 | 0.75 | 0.9 | 1.12 | 1.79 |
| 2018-05-28 | 0.75 | 0.9 | 1.12 | 1.76 |
| 2018-05-29 | 0.75 | 0.9 | 1.12 | 1.7 |
| 2018-05-30 | 0.75 | 0.9 | 1.12 | 1.68 |
| 2018-05-31 | 0.75 | 0.9 | 1.12 | 1.73 |
| 2018-06-01 | 0.75 | 0.9 | 1.12 | 1.72 |
| 2018-06-04 | 0.75 | 0.9 | 1.12 | 1.73 |
| 2018-06-05 | 0.75 | 0.9 | 1.12 | 1.76 |
| 2018-06-06 | 0.75 | 0.9 | 1.12 | 1.83 |
| 2018-06-07 | 0.75 | 0.9 | 1.12 | 1.86 |
| 2018-06-08 | 0.75 | 0.9 | 1.12 | 1.84 |
| 2018-06-11 | 0.75 | 0.92 | 1.13 | 1.93 |
| 2018-06-12 | 0.75 | 0.92 | 1.14 | 1.93 |
| 2018-06-13 | 0.75 | 0.92 | 1.14 | 1.91 |
| 2018-06-14 | 0.75 | 0.93 | 1.14 | 1.94 |
| 2018-06-15 | 0.75 | 0.92 | 1.14 | 1.94 |
| 2018-06-18 | 0.75 | 0.93 | 1.15 | 1.91 |
| 2018-06-19 | 0.75 | 0.93 | 1.15 | 1.87 |
| 2018-06-20 | 0.75 | 0.93 | 1.15 | 1.85 |
| 2018-06-21 | 0.75 | 0.93 | 1.15 | 1.85 |
| 2018-06-22 | 0.75 | 0.93 | 1.16 | 1.85 |
| 2018-06-25 | 0.75 | 0.93 | 1.16 | 1.8 |
| 2018-06-26 | 0.75 | 0.93 | 1.16 | 1.84 |
| 2018-06-27 | 0.75 | 0.93 | 1.16 | 1.82 |
| 2018-06-28 | 1 | 1.16 | 1.35 | 1.94 |
| 2018-06-29 | 1 | 1.16 | 1.35 | 1.94 |
| 2018-07-02 | 1 | 1.16 | 1.35 | 1.92 |
| 2018-07-03 | 1 | 1.16 | 1.35 | 1.97 |
| 2018-07-04 | 1 | 1.17 | 1.36 | 2 |
| 2018-07-09 | 1 | 1.17 | 1.37 | 1.92 |
| 2018-07-10 | 1 | 1.17 | 1.37 | 1.94 |
| 2018-07-11 | 1 | 1.18 | 1.38 | 2.02 |
| 2018-07-12 | 1 | 1.18 | 1.38 | 2.02 |
| 2018-07-13 | 1 | 1.18 | 1.39 | 2.05 |
| 2018-07-16 | 1 | 1.18 | 1.39 | 2.03 |
| 2018-07-17 | 1 | 1.19 | 1.4 | 2.03 |
| 2018-07-18 | 1 | 1.18 | 1.39 | 2.01 |
| 2018-07-19 | 1 | 1.19 | 1.39 | 2.02 |
| 2018-07-20 | 1 | 1.18 | 1.39 | 2.01 |
| 2018-07-23 | 1 | 1.19 | 1.39 | 2.03 |
| 2018-07-24 | 1 | 1.19 | 1.4 | 2.08 |
| 2018-07-25 | 1 | 1.2 | 1.41 | 2.09 |
| 2018-07-26 | 1 | 1.2 | 1.41 | 2.12 |
| 2018-07-27 | 1 | 1.2 | 1.41 | 2.15 |
| 2018-07-30 | 1 | 1.21 | 1.43 | 2.15 |
| 2018-07-31 | 1 | 1.22 | 1.43 | 2.17 |
| 2018-08-01 | 1 | 1.23 | 1.45 | 2.18 |
| 2018-08-02 | 1 | 1.24 | 1.45 | 2.17 |
| 2018-08-03 | 1.25 | 1.42 | 1.61 | 2.21 |
| 2018-08-06 | 1.25 | 1.44 | 1.64 | 2.19 |
| 2018-08-07 | 1.25 | 1.45 | 1.65 | 2.19 |
| 2018-08-08 | 1.25 | 1.45 | 1.66 | 2.19 |
| 2018-08-09 | 1.25 | 1.46 | 1.67 | 2.17 |
| 2018-08-10 | 1.25 | 1.46 | 1.67 | 2.18 |
| 2018-08-13 | 1.25 | 1.46 | 1.68 | 2.15 |
| 2018-08-14 | 1.25 | 1.46 | 1.68 | 2.13 |
| 2018-08-15 | 1.25 | 1.46 | 1.68 | 2.16 |
| 2018-08-16 | 1.25 | 1.46 | 1.68 | 2.17 |
| 2018-08-17 | 1.25 | 1.47 | 1.68 | 2.18 |
| 2018-08-20 | 1.25 | 1.47 | 1.69 | 2.2 |
| 2018-08-21 | 1.25 | 1.48 | 1.7 | 2.22 |
| 2018-08-22 | 1.25 | 1.48 | 1.71 | 2.22 |
| 2018-08-23 | 1.25 | 1.48 | 1.71 | 2.23 |
| 2018-08-24 | 1.25 | 1.48 | 1.71 | 2.24 |
| 2018-08-27 | 1.25 | 1.49 | 1.71 | 2.24 |
| 2018-08-28 | 1.25 | 1.49 | 1.72 | 2.24 |
| 2018-08-29 | 1.25 | 1.49 | 1.72 | 2.24 |
| 2018-08-30 | 1.25 | 1.49 | 1.73 | 2.24 |
| 2018-08-31 | 1.25 | 1.5 | 1.73 | 2.23 |
| 2018-09-03 | 1.25 | 1.5 | 1.73 | 2.23 |
| 2018-09-04 | 1.25 | 1.5 | 1.74 | 2.25 |
| 2018-09-05 | 1.25 | 1.51 | 1.74 | 2.29 |
| 2018-09-06 | 1.25 | 1.51 | 1.75 | 2.3 |
| 2018-09-07 | 1.25 | 1.51 | 1.74 | 2.3 |
| 2018-09-10 | 1.25 | 1.51 | 1.75 | 2.3 |
| 2018-09-11 | 1.25 | 1.52 | 1.77 | 2.37 |
| 2018-09-12 | 1.25 | 1.53 | 1.78 | 2.4 |
| 2018-09-13 | 1.25 | 1.54 | 1.78 | 2.39 |
| 2018-09-14 | 1.25 | 1.54 | 1.79 | 2.39 |
| 2018-09-17 | 1.25 | 1.54 | 1.79 | 2.39 |
| 2018-09-18 | 1.25 | 1.55 | 1.8 | 2.39 |
| 2018-09-19 | 1.25 | 1.56 | 1.81 | 2.42 |
| 2018-09-20 | 1.25 | 1.56 | 1.81 | 2.44 |
| 2018-09-21 | 1.25 | 1.56 | 1.82 | 2.43 |
| 2018-09-24 | 1.25 | 1.56 | 1.82 | 2.43 |
| 2018-09-25 | 1.25 | 1.57 | 1.82 | 2.46 |
| 2018-09-26 | 1.25 | 1.58 | 1.83 | 2.46 |
| 2018-09-27 | 1.5 | 1.7 | 1.89 | 2.43 |
| 2018-10-01 | 1.5 | 1.72 | 1.9 | 2.43 |
| 2018-10-02 | 1.5 | 1.73 | 1.91 | 2.43 |
| 2018-10-03 | 1.5 | 1.73 | 1.92 | 2.5 |
| 2018-10-04 | 1.5 | 1.74 | 1.93 | 2.57 |
| 2018-10-05 | 1.5 | 1.74 | 1.93 | 2.56 |
| 2018-10-08 | 1.5 | 1.74 | 1.93 | 2.56 |
| 2018-10-09 | 1.5 | 1.75 | 1.93 | 2.6 |
| 2018-10-10 | 1.5 | 1.75 | 1.94 | 2.61 |
| 2018-10-11 | 1.5 | 1.75 | 1.95 | 2.61 |
| 2018-10-12 | 1.5 | 1.75 | 1.96 | 2.63 |
| 2018-10-15 | 1.5 | 1.76 | 1.96 | 2.64 |
| 2018-10-16 | 1.5 | 1.76 | 1.97 | 2.66 |
| 2018-10-17 | 1.5 | 1.76 | 1.97 | 2.65 |
| 2018-10-18 | 1.5 | 1.76 | 1.97 | 2.66 |
| 2018-10-19 | 1.5 | 1.77 | 1.97 | 2.64 |
| 2018-10-22 | 1.5 | 1.77 | 1.97 | 2.67 |
| 2018-10-23 | 1.5 | 1.77 | 1.98 | 2.64 |
| 2018-10-24 | 1.5 | 1.78 | 1.98 | 2.57 |
| 2018-10-25 | 1.5 | 1.78 | 1.97 | 2.56 |
| 2018-10-26 | 1.5 | 1.79 | 1.98 | 2.56 |
| 2018-10-29 | 1.5 | 1.8 | 1.99 | 2.55 |
| 2018-10-30 | 1.5 | 1.8 | 1.99 | 2.56 |
| 2018-10-31 | 1.5 | 1.81 | 2 | 2.58 |
| 2018-11-01 | 1.5 | 1.82 | 2.01 | 2.6 |
| 2018-11-02 | 1.75 | 1.96 | 2.14 | 2.58 |
| 2018-11-05 | 1.75 | 1.97 | 2.14 | 2.57 |
| 2018-11-06 | 1.75 | 1.97 | 2.15 | 2.52 |
| 2018-11-07 | 1.75 | 1.97 | 2.16 | 2.56 |
| 2018-11-08 | 1.75 | 1.98 | 2.17 | 2.6 |
| 2018-11-09 | 1.75 | 1.99 | 2.18 | 2.6 |
| 2018-11-12 | 1.75 | 1.99 | 2.18 | 2.6 |
| 2018-11-13 | 1.75 | 1.99 | 2.18 | 2.62 |
| 2018-11-14 | 1.75 | 1.99 | 2.19 | 2.58 |
| 2018-11-15 | 1.75 | 2 | 2.2 | 2.56 |
| 2018-11-16 | 1.75 | 2 | 2.2 | 2.56 |
| 2018-11-19 | 1.75 | 2 | 2.2 | 2.55 |
| 2018-11-20 | 1.75 | 2.01 | 2.21 | 2.53 |
| 2018-11-21 | 1.75 | 2.01 | 2.21 | 2.51 |
| 2018-11-22 | 1.75 | 2.01 | 2.21 | 2.48 |
| 2018-11-23 | 1.75 | 2.02 | 2.22 | 2.49 |
| 2018-11-26 | 1.75 | 2.02 | 2.22 | 2.46 |
| 2018-11-27 | 1.75 | 2.02 | 2.22 | 2.4 |
| 2018-11-28 | 1.75 | 2.02 | 2.22 | 2.4 |
| 2018-11-29 | 1.75 | 2.02 | 2.22 | 2.42 |
| 2018-11-30 | 1.75 | 2.02 | 2.22 | 2.41 |
| 2018-12-03 | 1.75 | 2.01 | 2.21 | 2.47 |
| 2018-12-04 | 1.75 | 2.01 | 2.21 | 2.4 |
| 2018-12-05 | 1.75 | 2.01 | 2.21 | 2.37 |
| 2018-12-06 | 1.75 | 2.01 | 2.21 | 2.37 |
| 2018-12-07 | 1.75 | 2.01 | 2.21 | 2.36 |
| 2018-12-10 | 1.75 | 2.01 | 2.21 | 2.34 |
| 2018-12-11 | 1.75 | 2.01 | 2.21 | 2.32 |
| 2018-12-12 | 1.75 | 2.01 | 2.21 | 2.34 |
| 2018-12-13 | 1.75 | 2.02 | 2.21 | 2.36 |
| 2018-12-14 | 1.75 | 2.02 | 2.21 | 2.35 |
| 2018-12-17 | 1.75 | 2.02 | 2.21 | 2.33 |
| 2018-12-18 | 1.75 | 2.02 | 2.21 | 2.3 |
| 2018-12-19 | 1.75 | 2.02 | 2.21 | 2.29 |
| 2018-12-20 | 1.75 | 2.02 | 2.21 | 2.11 |
| 2018-12-21 | 1.75 | 2.02 | 2.21 | 2.06 |
| 2018-12-27 | 1.75 | 2.01 | 2.2 | 1.99 |
| 2018-12-28 | 1.75 | 2.02 | 2.21 | 1.86 |
| 2018-12-31 | 1.75 | 2.01 | 2.21 | 1.85 |
| 2019-01-02 | 1.75 | 2.01 | 2.2 | 1.75 |
| 2019-01-03 | 1.75 | 2.01 | 2.2 | 1.74 |
| 2019-01-04 | 1.75 | 2.01 | 2.21 | 1.83 |
| 2019-01-07 | 1.75 | 2.01 | 2.21 | 1.88 |
| 2019-01-08 | 1.75 | 2.01 | 2.21 | 1.9 |
| 2019-01-09 | 1.75 | 2.01 | 2.21 | 2 |
| 2019-01-10 | 1.75 | 2.01 | 2.21 | 1.97 |
| 2019-01-11 | 1.75 | 2.01 | 2.21 | 1.94 |
| 2019-01-14 | 1.75 | 2.01 | 2.21 | 1.88 |
| 2019-01-15 | 1.75 | 2.01 | 2.21 | 1.77 |
| 2019-01-16 | 1.75 | 2.01 | 2.21 | 1.88 |
| 2019-01-17 | 1.75 | 2.01 | 2.21 | 1.94 |
| 2019-01-18 | 1.75 | 2.01 | 2.22 | 2.01 |
| 2019-01-21 | 1.75 | 2.01 | 2.22 | 1.99 |
| 2019-01-22 | 1.75 | 2.01 | 2.22 | 1.99 |
| 2019-01-23 | 1.75 | 2.01 | 2.22 | 1.96 |
| 2019-01-24 | 1.75 | 2 | 2.22 | 1.97 |
| 2019-01-25 | 1.75 | 2 | 2.22 | 1.93 |
| 2019-01-28 | 1.75 | 2 | 2.22 | 1.93 |
| 2019-01-29 | 1.75 | 1.99 | 2.22 | 1.96 |
| 2019-01-30 | 1.75 | 1.99 | 2.21 | 1.93 |
| 2019-01-31 | 1.75 | 1.99 | 2.21 | 1.86 |
| 2019-02-01 | 1.75 | 1.99 | 2.21 | 1.86 |
| 2019-02-04 | 1.75 | 1.99 | 2.2 | 1.84 |
| 2019-02-05 | 1.75 | 1.99 | 2.2 | 1.83 |
| 2019-02-06 | 1.75 | 1.99 | 2.2 | 1.82 |
| 2019-02-07 | 1.75 | 1.99 | 2.2 | 1.79 |
| 2019-02-08 | 1.75 | 1.99 | 2.2 | 1.78 |
| 2019-02-11 | 1.75 | 1.99 | 2.2 | 1.76 |
| 2019-02-12 | 1.75 | 1.99 | 2.2 | 1.78 |
| 2019-02-13 | 1.75 | 2 | 2.19 | 1.83 |
| 2019-02-14 | 1.75 | 2 | 2.19 | 1.9 |
| 2019-02-15 | 1.75 | 2.01 | 2.19 | 1.93 |
| 2019-02-18 | 1.75 | 2.02 | 2.19 | 1.97 |
| 2019-02-19 | 1.75 | 2.02 | 2.19 | 1.98 |
| 2019-02-20 | 1.75 | 2.02 | 2.19 | 1.92 |
| 2019-02-21 | 1.75 | 2.02 | 2.19 | 1.95 |
| 2019-02-22 | 1.75 | 2.02 | 2.19 | 1.98 |
| 2019-02-25 | 1.75 | 2.02 | 2.2 | 1.99 |
| 2019-02-26 | 1.75 | 2.02 | 2.2 | 2 |
| 2019-02-27 | 1.75 | 2.02 | 2.2 | 2.02 |
| 2019-02-28 | 1.75 | 2.02 | 2.2 | 2.06 |
| 2019-03-01 | 1.75 | 2.03 | 2.2 | 2.07 |
| 2019-03-04 | 1.75 | 2.03 | 2.2 | 2.1 |
| 2019-03-05 | 1.75 | 2.03 | 2.2 | 2.1 |
| 2019-03-06 | 1.75 | 2.03 | 2.2 | 2.07 |
| 2019-03-07 | 1.75 | 2.03 | 2.21 | 2.06 |
| 2019-03-08 | 1.75 | 2.03 | 2.2 | 1.99 |
| 2019-03-11 | 1.75 | 2.03 | 2.2 | 1.99 |
| 2019-03-12 | 1.75 | 2.03 | 2.2 | 1.99 |
| 2019-03-13 | 1.75 | 2.03 | 2.2 | 1.96 |
| 2019-03-14 | 1.75 | 2.03 | 2.2 | 1.98 |
| 2019-03-15 | 1.75 | 2.03 | 2.2 | 2.02 |
| 2019-03-18 | 1.75 | 2.03 | 2.2 | 2.04 |
| 2019-03-19 | 1.75 | 2.03 | 2.2 | 2.05 |
| 2019-03-20 | 1.75 | 2.03 | 2.2 | 2.06 |
| 2019-03-21 | 1.75 | 2.03 | 2.2 | 1.98 |
| 2019-03-22 | 1.75 | 2.03 | 2.2 | 1.93 |
| 2019-03-25 | 1.75 | 2.02 | 2.2 | 1.87 |
| 2019-03-26 | 1.75 | 2.02 | 2.2 | 1.87 |
| 2019-03-27 | 1.75 | 2.02 | 2.2 | 1.86 |
| 2019-03-28 | 1.75 | 2.02 | 2.2 | 1.8 |
| 2019-03-29 | 1.75 | 2.02 | 2.2 | 1.83 |
| 2019-04-01 | 1.75 | 2.02 | 2.2 | 1.84 |
| 2019-04-02 | 1.75 | 2.02 | 2.2 | 1.87 |
| 2019-04-03 | 1.75 | 2.02 | 2.2 | 1.93 |
| 2019-04-04 | 1.75 | 2.02 | 2.2 | 1.94 |
| 2019-04-05 | 1.75 | 2.02 | 2.2 | 1.99 |
| 2019-04-08 | 1.75 | 2.02 | 2.2 | 1.98 |
| 2019-04-09 | 1.75 | 2.02 | 2.2 | 1.97 |
| 2019-04-10 | 1.75 | 2.02 | 2.2 | 1.97 |
| 2019-04-11 | 1.75 | 2.02 | 2.2 | 1.93 |
| 2019-04-12 | 1.75 | 2.02 | 2.21 | 1.95 |
| 2019-04-15 | 1.75 | 2.02 | 2.21 | 1.97 |
| 2019-04-16 | 1.75 | 2.02 | 2.21 | 1.96 |
| 2019-04-17 | 1.75 | 2.02 | 2.21 | 1.98 |
| 2019-04-18 | 1.75 | 2.02 | 2.21 | 1.98 |
| 2019-04-23 | 1.75 | 2.02 | 2.22 | 1.96 |
| 2019-04-24 | 1.75 | 2.02 | 2.22 | 1.99 |
| 2019-04-25 | 1.75 | 2.02 | 2.22 | 2 |
| 2019-04-26 | 1.75 | 2.03 | 2.23 | 2.06 |
| 2019-04-29 | 1.75 | 2.04 | 2.23 | 2.06 |
| 2019-04-30 | 1.75 | 2.05 | 2.23 | 2.13 |
| 2019-05-02 | 1.75 | 2.05 | 2.23 | 2.13 |
| 2019-05-03 | 2 | 2.2 | 2.34 | 2.12 |
| 2019-05-06 | 2 | 2.21 | 2.34 | 2.09 |
| 2019-05-07 | 2 | 2.21 | 2.34 | 2.08 |
| 2019-05-09 | 2 | 2.21 | 2.34 | 2.06 |
| 2019-05-10 | 2 | 2.2 | 2.34 | 2.08 |
| 2019-05-13 | 2 | 2.2 | 2.33 | 2.05 |
| 2019-05-14 | 2 | 2.2 | 2.33 | 2.02 |
| 2019-05-15 | 2 | 2.2 | 2.32 | 1.95 |
| 2019-05-16 | 2 | 2.2 | 2.32 | 1.95 |
| 2019-05-17 | 2 | 2.2 | 2.32 | 1.96 |
| 2019-05-20 | 2 | 2.2 | 2.32 | 1.97 |
| 2019-05-21 | 2 | 2.2 | 2.32 | 1.96 |
| 2019-05-22 | 2 | 2.2 | 2.32 | 1.92 |
| 2019-05-23 | 2 | 2.19 | 2.31 | 1.88 |
| 2019-05-24 | 2 | 2.19 | 2.31 | 1.88 |
| 2019-05-27 | 2 | 2.19 | 2.31 | 1.9 |
| 2019-05-28 | 2 | 2.19 | 2.31 | 1.88 |
| 2019-05-29 | 2 | 2.19 | 2.31 | 1.87 |
| 2019-05-30 | 2 | 2.19 | 2.31 | 1.86 |
| 2019-05-31 | 2 | 2.19 | 2.31 | 1.79 |
| 2019-06-03 | 2 | 2.19 | 2.31 | 1.77 |
| 2019-06-04 | 2 | 2.18 | 2.3 | 1.78 |
| 2019-06-05 | 2 | 2.18 | 2.3 | 1.82 |
| 2019-06-06 | 2 | 2.18 | 2.3 | 1.79 |
| 2019-06-07 | 2 | 2.18 | 2.3 | 1.8 |
| 2019-06-10 | 2 | 2.17 | 2.29 | 1.79 |
| 2019-06-11 | 2 | 2.17 | 2.29 | 1.81 |
| 2019-06-12 | 2 | 2.17 | 2.29 | 1.77 |
| 2019-06-13 | 2 | 2.17 | 2.29 | 1.73 |
| 2019-06-14 | 2 | 2.17 | 2.29 | 1.68 |
| 2019-06-17 | 2 | 2.17 | 2.29 | 1.7 |
| 2019-06-18 | 2 | 2.17 | 2.29 | 1.66 |
| 2019-06-19 | 2 | 2.17 | 2.29 | 1.66 |
| 2019-06-20 | 2 | 2.17 | 2.29 | 1.65 |
| 2019-06-21 | 2 | 2.17 | 2.29 | 1.67 |
| 2019-06-24 | 2 | 2.17 | 2.29 | 1.68 |
| 2019-06-25 | 2 | 2.17 | 2.29 | 1.68 |
| 2019-06-26 | 2 | 2.17 | 2.29 | 1.69 |
| 2019-06-27 | 2 | 2.17 | 2.29 | 1.72 |
| 2019-06-28 | 2 | 2.17 | 2.29 | 1.69 |
| 2019-07-01 | 2 | 2.17 | 2.29 | 1.68 |
| 2019-07-02 | 2 | 2.17 | 2.29 | 1.67 |
| 2019-07-03 | 2 | 2.17 | 2.29 | 1.59 |
| 2019-07-04 | 2 | 2.17 | 2.29 | 1.59 |
| 2019-07-08 | 2 | 2.17 | 2.29 | 1.63 |
| 2019-07-09 | 2 | 2.17 | 2.28 | 1.6 |
| 2019-07-10 | 2 | 2.17 | 2.28 | 1.63 |
| 2019-07-11 | 2 | 2.17 | 2.28 | 1.62 |
| 2019-07-12 | 2 | 2.17 | 2.28 | 1.72 |
| 2019-07-15 | 2 | 2.16 | 2.28 | 1.7 |
| 2019-07-16 | 2 | 2.16 | 2.28 | 1.7 |
| 2019-07-17 | 2 | 2.16 | 2.28 | 1.7 |
| 2019-07-18 | 2 | 2.16 | 2.28 | 1.7 |
| 2019-07-19 | 2 | 2.16 | 2.28 | 1.7 |
| 2019-07-22 | 2 | 2.16 | 2.28 | 1.7 |
| 2019-07-23 | 2 | 2.16 | 2.28 | 1.69 |
| 2019-07-24 | 2 | 2.16 | 2.28 | 1.59 |
| 2019-07-25 | 2 | 2.16 | 2.28 | 1.56 |
| 2019-07-26 | 2 | 2.16 | 2.27 | 1.6 |
| 2019-07-29 | 2 | 2.16 | 2.27 | 1.6 |
| 2019-07-30 | 2 | 2.16 | 2.27 | 1.61 |
| 2019-07-31 | 2 | 2.16 | 2.27 | 1.62 |
| 2019-08-01 | 2 | 2.16 | 2.27 | 1.62 |
| 2019-08-02 | 2 | 2.16 | 2.26 | 1.54 |
| 2019-08-05 | 2 | 2.15 | 2.25 | 1.44 |
| 2019-08-06 | 2 | 2.15 | 2.25 | 1.44 |
| 2019-08-07 | 2 | 2.15 | 2.24 | 1.41 |
| 2019-08-08 | 2 | 2.14 | 2.24 | 1.32 |
| 2019-08-09 | 2 | 2.14 | 2.23 | 1.29 |
| 2019-08-12 | 2 | 2.14 | 2.23 | 1.33 |
| 2019-08-13 | 2 | 2.14 | 2.22 | 1.27 |
| 2019-08-14 | 2 | 2.14 | 2.21 | 1.23 |
| 2019-08-15 | 2 | 2.14 | 2.21 | 1.19 |
| 2019-08-16 | 2 | 2.14 | 2.2 | 1.21 |
| 2019-08-19 | 2 | 2.14 | 2.21 | 1.25 |
| 2019-08-20 | 2 | 2.14 | 2.21 | 1.25 |
| 2019-08-21 | 2 | 2.14 | 2.21 | 1.27 |
| 2019-08-22 | 2 | 2.14 | 2.2 | 1.3 |
| 2019-08-23 | 2 | 2.14 | 2.2 | 1.37 |
| 2019-08-26 | 2 | 2.14 | 2.2 | 1.32 |
| 2019-08-27 | 2 | 2.14 | 2.2 | 1.27 |
| 2019-08-28 | 2 | 2.14 | 2.2 | 1.2 |
| 2019-08-29 | 2 | 2.14 | 2.2 | 1.25 |
| 2019-08-30 | 2 | 2.14 | 2.2 | 1.3 |
| 2019-09-02 | 2 | 2.14 | 2.2 | 1.3 |
| 2019-09-03 | 2 | 2.14 | 2.2 | 1.28 |
| 2019-09-04 | 2 | 2.14 | 2.2 | 1.32 |
| 2019-09-05 | 2 | 2.14 | 2.2 | 1.39 |
| 2019-09-06 | 2 | 2.14 | 2.2 | 1.48 |
| 2019-09-09 | 2 | 2.14 | 2.2 | 1.51 |
| 2019-09-10 | 2 | 2.14 | 2.2 | 1.56 |
| 2019-09-11 | 2 | 2.14 | 2.2 | 1.62 |
| 2019-09-12 | 2 | 2.14 | 2.2 | 1.55 |
| 2019-09-13 | 2 | 2.14 | 2.2 | 1.63 |
| 2019-09-16 | 2 | 2.14 | 2.2 | 1.66 |
| 2019-09-17 | 2 | 2.14 | 2.2 | 1.67 |
| 2019-09-18 | 2 | 2.14 | 2.2 | 1.62 |
| 2019-09-19 | 2 | 2.14 | 2.2 | 1.6 |
| 2019-09-20 | 2 | 2.14 | 2.2 | 1.61 |
| 2019-09-23 | 2 | 2.14 | 2.2 | 1.58 |
| 2019-09-24 | 2 | 2.14 | 2.2 | 1.56 |
| 2019-09-25 | 2 | 2.14 | 2.2 | 1.53 |
| 2019-09-26 | 2 | 2.15 | 2.22 | 1.67 |
| 2019-09-27 | 2 | 2.16 | 2.23 | 1.65 |
| 2019-09-30 | 2 | 2.16 | 2.24 | 1.7 |
| 2019-10-01 | 2 | 2.16 | 2.25 | 1.78 |
| 2019-10-02 | 2 | 2.16 | 2.26 | 1.71 |
| 2019-10-03 | 2 | 2.17 | 2.26 | 1.59 |
| 2019-10-04 | 2 | 2.17 | 2.25 | 1.55 |
| 2019-10-07 | 2 | 2.17 | 2.26 | 1.57 |
| 2019-10-08 | 2 | 2.17 | 2.27 | 1.54 |
| 2019-10-09 | 2 | 2.17 | 2.27 | 1.55 |
| 2019-10-10 | 2 | 2.17 | 2.27 | 1.54 |
| 2019-10-11 | 2 | 2.17 | 2.27 | 1.64 |
| 2019-10-14 | 2 | 2.17 | 2.28 | 1.7 |
| 2019-10-15 | 2 | 2.17 | 2.28 | 1.72 |
| 2019-10-16 | 2 | 2.18 | 2.29 | 1.79 |
| 2019-10-17 | 2 | 2.18 | 2.29 | 1.84 |
| 2019-10-18 | 2 | 2.18 | 2.29 | 1.85 |
| 2019-10-21 | 2 | 2.18 | 2.29 | 1.78 |
| 2019-10-22 | 2 | 2.18 | 2.29 | 1.74 |
| 2019-10-23 | 2 | 2.18 | 2.29 | 1.76 |
| 2019-10-24 | 2 | 2.18 | 2.28 | 1.73 |
| 2019-10-25 | 2 | 2.18 | 2.28 | 1.74 |
| 2019-10-29 | 2 | 2.18 | 2.28 | 1.77 |
| 2019-10-30 | 2 | 2.18 | 2.28 | 1.78 |
| 2019-10-31 | 2 | 2.18 | 2.28 | 1.75 |
| 2019-11-01 | 2 | 2.17 | 2.27 | 1.74 |
| 2019-11-04 | 2 | 2.18 | 2.28 | 1.79 |
| 2019-11-05 | 2 | 2.18 | 2.28 | 1.82 |
| 2019-11-06 | 2 | 2.18 | 2.28 | 1.83 |
| 2019-11-07 | 2 | 2.18 | 2.28 | 1.85 |
| 2019-11-08 | 2 | 2.19 | 2.29 | 1.97 |
| 2019-11-11 | 2 | 2.18 | 2.29 | 1.99 |
| 2019-11-12 | 2 | 2.18 | 2.29 | 1.97 |
| 2019-11-13 | 2 | 2.18 | 2.29 | 1.92 |
| 2019-11-14 | 2 | 2.17 | 2.28 | 1.85 |
| 2019-11-15 | 2 | 2.17 | 2.28 | 1.83 |
| 2019-11-18 | 2 | 2.18 | 2.29 | 1.85 |
| 2019-11-19 | 2 | 2.18 | 2.29 | 1.87 |
| 2019-11-20 | 2 | 2.18 | 2.28 | 1.85 |
| 2019-11-21 | 2 | 2.18 | 2.28 | 1.86 |
| 2019-11-22 | 2 | 2.18 | 2.28 | 1.87 |
| 2019-11-25 | 2 | 2.18 | 2.28 | 1.87 |
| 2019-11-26 | 2 | 2.18 | 2.28 | 1.84 |
| 2019-11-27 | 2 | 2.18 | 2.28 | 1.81 |
| 2019-11-28 | 2 | 2.18 | 2.28 | 1.81 |
| 2019-11-29 | 2 | 2.18 | 2.28 | 1.83 |
| 2019-12-02 | 2 | 2.18 | 2.28 | 1.89 |
| 2019-12-03 | 2 | 2.18 | 2.27 | 1.88 |
| 2019-12-04 | 2 | 2.18 | 2.26 | 1.87 |
| 2019-12-05 | 2 | 2.18 | 2.26 | 1.9 |
| 2019-12-06 | 2 | 2.18 | 2.26 | 1.91 |
| 2019-12-09 | 2 | 2.18 | 2.26 | 1.91 |
| 2019-12-10 | 2 | 2.18 | 2.26 | 1.93 |
| 2019-12-11 | 2 | 2.18 | 2.26 | 1.89 |
| 2019-12-12 | 2 | 2.18 | 2.26 | 1.88 |
| 2019-12-13 | 2 | 2.18 | 2.27 | 1.96 |
| 2019-12-16 | 2 | 2.18 | 2.27 | 1.93 |
| 2019-12-17 | 2 | 2.18 | 2.27 | 1.95 |
| 2019-12-18 | 2 | 2.18 | 2.27 | 1.95 |
| 2019-12-19 | 2 | 2.18 | 2.27 | 2.05 |
| 2019-12-20 | 2 | 2.18 | 2.27 | 2.03 |
| 2019-12-23 | 2 | 2.18 | 2.27 | 2.01 |
| 2019-12-27 | 2 | 2.18 | 2.27 | 2.02 |
| 2019-12-30 | 2 | 2.18 | 2.27 | 2.05 |
| 2019-12-31 | 2 | 2.18 | 2.27 | 2.07 |
| 2020-01-02 | 2 | 2.18 | 2.27 | 2.11 |
| 2020-01-03 | 2 | 2.17 | 2.27 | 2.03 |
| 2020-01-06 | 2 | 2.17 | 2.27 | 2.02 |
| 2020-01-07 | 2 | 2.17 | 2.27 | 2.04 |
| 2020-01-08 | 2 | 2.17 | 2.27 | 2.05 |
| 2020-01-09 | 2 | 2.17 | 2.27 | 2.07 |
| 2020-01-10 | 2 | 2.17 | 2.27 | 2.06 |
| 2020-01-13 | 2 | 2.17 | 2.27 | 2.13 |
| 2020-01-14 | 2 | 2.17 | 2.28 | 2.15 |
| 2020-01-15 | 2 | 2.17 | 2.28 | 2.08 |
| 2020-01-16 | 2 | 2.17 | 2.28 | 2.11 |
| 2020-01-17 | 2 | 2.17 | 2.28 | 2.05 |
| 2020-01-20 | 2 | 2.17 | 2.28 | 2.09 |
| 2020-01-21 | 2 | 2.17 | 2.28 | 2.08 |
| 2020-01-22 | 2 | 2.17 | 2.28 | 2.04 |
| 2020-01-23 | 2 | 2.17 | 2.28 | 1.9 |
| 2020-01-24 | 2 | 2.17 | 2.28 | 1.88 |
| 2020-01-27 | 2 | 2.17 | 2.27 | 1.84 |
| 2020-01-28 | 2 | 2.17 | 2.27 | 1.82 |
| 2020-01-29 | 2 | 2.17 | 2.27 | 1.9 |
| 2020-01-30 | 2 | 2.16 | 2.27 | 1.81 |
| 2020-01-31 | 2 | 2.16 | 2.27 | 1.82 |
| 2020-02-03 | 2 | 2.16 | 2.27 | 1.8 |
| 2020-02-04 | 2 | 2.16 | 2.27 | 1.86 |
| 2020-02-05 | 2 | 2.16 | 2.27 | 1.9 |
| 2020-02-06 | 2 | 2.16 | 2.27 | 1.89 |
| 2020-02-07 | 2.25 | 2.39 | 2.48 | 1.91 |
| 2020-02-10 | 2.25 | 2.39 | 2.47 | 1.91 |
| 2020-02-11 | 2.25 | 2.39 | 2.46 | 1.95 |
| 2020-02-12 | 2.25 | 2.39 | 2.45 | 2 |
| 2020-02-13 | 2.25 | 2.39 | 2.45 | 1.96 |
| 2020-02-14 | 2.25 | 2.39 | 2.45 | 1.99 |
| 2020-02-17 | 2.25 | 2.39 | 2.45 | 2 |
| 2020-02-18 | 2.25 | 2.39 | 2.45 | 1.98 |
| 2020-02-19 | 2.25 | 2.39 | 2.45 | 1.94 |
| 2020-02-20 | 2.25 | 2.39 | 2.45 | 1.91 |
| 2020-02-21 | 2.25 | 2.39 | 2.45 | 1.89 |
| 2020-02-24 | 2.25 | 2.39 | 2.45 | 1.84 |
| 2020-02-25 | 2.25 | 2.39 | 2.45 | 1.78 |
| 2020-02-26 | 2.25 | 2.39 | 2.45 | 1.74 |
| 2020-02-27 | 2.25 | 2.39 | 2.45 | 1.75 |
| 2020-02-28 | 2.25 | 2.38 | 2.43 | 1.55 |
| 2020-03-02 | 2.25 | 2.37 | 2.41 | 1.47 |
| 2020-03-03 | 2.25 | 2.35 | 2.38 | 1.52 |
| 2020-03-04 | 2.25 | 2.34 | 2.37 | 1.37 |
| 2020-03-05 | 2.25 | 2.34 | 2.37 | 1.45 |
| 2020-03-06 | 2.25 | 2.34 | 2.37 | 1.28 |
| 2020-03-09 | 2.25 | 2.34 | 2.36 | 1.02 |
| 2020-03-10 | 2.25 | 2.34 | 2.36 | 1.14 |
| 2020-03-11 | 2.25 | 2.33 | 2.36 | 1.08 |
| 2020-03-12 | 2.25 | 2.32 | 2.34 | 1.17 |
| 2020-03-13 | 2.25 | 2.31 | 2.34 | 1.34 |
| 2020-03-16 | 2.25 | 2.31 | 2.33 | 1.24 |
| 2020-03-17 | 1.75 | 1.83 | 1.85 | 1.07 |
| 2020-03-18 | 1.75 | 1.8 | 1.8 | 1.01 |
| 2020-03-19 | 1.75 | 1.79 | 1.77 | 0.87 |
| 2020-03-20 | 1.75 | 1.78 | 1.77 | 0.83 |
| 2020-03-23 | 1.75 | 1.76 | 1.75 | 0.73 |
| 2020-03-24 | 1.75 | 1.74 | 1.72 | 0.66 |
| 2020-03-25 | 1.75 | 1.72 | 1.71 | 0.79 |
| 2020-03-26 | 1.75 | 1.71 | 1.68 | 0.79 |
| 2020-03-27 | 1 | 1.08 | 1.11 | 0.71 |
| 2020-03-30 | 1 | 1.04 | 1.04 | 0.68 |
| 2020-03-31 | 1 | 1.03 | 1 | 0.75 |
| 2020-04-01 | 1 | 1.02 | 0.98 | 0.74 |
| 2020-04-02 | 1 | 1.02 | 0.98 | 0.81 |
| 2020-04-03 | 1 | 1.01 | 0.97 | 0.79 |
| 2020-04-06 | 1 | 1.01 | 0.97 | 0.78 |
| 2020-04-07 | 1 | 1.01 | 0.97 | 0.78 |
| 2020-04-08 | 1 | 1 | 0.97 | 0.79 |
| 2020-04-09 | 1 | 1 | 0.97 | 0.83 |
| 2020-04-14 | 1 | 0.98 | 0.94 | 0.81 |
| 2020-04-15 | 1 | 0.98 | 0.93 | 0.76 |
| 2020-04-16 | 1 | 0.97 | 0.92 | 0.75 |
| 2020-04-17 | 1 | 0.97 | 0.91 | 0.73 |
| 2020-04-20 | 1 | 0.97 | 0.91 | 0.7 |
| 2020-04-21 | 1 | 0.96 | 0.89 | 0.7 |
| 2020-04-22 | 1 | 0.95 | 0.88 | 0.71 |
| 2020-04-23 | 1 | 0.93 | 0.88 | 0.73 |
| 2020-04-24 | 1 | 0.91 | 0.87 | 0.72 |
| 2020-04-27 | 1 | 0.9 | 0.87 | 0.72 |
| 2020-04-28 | 1 | 0.9 | 0.87 | 0.75 |
| 2020-04-29 | 1 | 0.9 | 0.86 | 0.73 |
| 2020-04-30 | 1 | 0.9 | 0.86 | 0.69 |
| 2020-05-04 | 1 | 0.9 | 0.86 | 0.66 |
| 2020-05-05 | 1 | 0.9 | 0.85 | 0.64 |
| 2020-05-06 | 1 | 0.89 | 0.83 | 0.64 |
| 2020-05-07 | 1 | 0.87 | 0.82 | 0.64 |
| 2020-05-11 | 0.25 | 0.35 | 0.43 | 0.59 |
| 2020-05-12 | 0.25 | 0.35 | 0.42 | 0.56 |
| 2020-05-13 | 0.25 | 0.35 | 0.41 | 0.48 |
| 2020-05-14 | 0.25 | 0.35 | 0.41 | 0.48 |
| 2020-05-15 | 0.25 | 0.34 | 0.41 | 0.42 |
| 2020-05-18 | 0.25 | 0.34 | 0.41 | 0.42 |
| 2020-05-19 | 0.25 | 0.34 | 0.41 | 0.46 |
| 2020-05-20 | 0.25 | 0.34 | 0.41 | 0.49 |
| 2020-05-21 | 0.25 | 0.34 | 0.41 | 0.49 |
| 2020-05-22 | 0.25 | 0.34 | 0.42 | 0.49 |
| 2020-05-25 | 0.25 | 0.34 | 0.42 | 0.51 |
| 2020-05-26 | 0.25 | 0.33 | 0.42 | 0.51 |
| 2020-05-27 | 0.25 | 0.34 | 0.42 | 0.51 |
| 2020-05-28 | 0.25 | 0.34 | 0.43 | 0.51 |
| 2020-05-29 | 0.25 | 0.34 | 0.43 | 0.47 |
| 2020-06-01 | 0.25 | 0.34 | 0.43 | 0.45 |
| 2020-06-02 | 0.25 | 0.34 | 0.43 | 0.47 |
| 2020-06-03 | 0.25 | 0.34 | 0.43 | 0.49 |
| 2020-06-04 | 0.25 | 0.34 | 0.43 | 0.53 |
| 2020-06-05 | 0.25 | 0.34 | 0.43 | 0.6 |
| 2020-06-08 | 0.25 | 0.34 | 0.43 | 0.69 |
| 2020-06-09 | 0.25 | 0.34 | 0.43 | 0.66 |
| 2020-06-10 | 0.25 | 0.34 | 0.43 | 0.67 |
| 2020-06-11 | 0.25 | 0.34 | 0.43 | 0.62 |
| 2020-06-12 | 0.25 | 0.34 | 0.43 | 0.62 |
| 2020-06-15 | 0.25 | 0.34 | 0.43 | 0.61 |
| 2020-06-16 | 0.25 | 0.34 | 0.43 | 0.63 |
| 2020-06-17 | 0.25 | 0.34 | 0.43 | 0.66 |
| 2020-06-18 | 0.25 | 0.34 | 0.43 | 0.66 |
| 2020-06-19 | 0.25 | 0.34 | 0.43 | 0.65 |
| 2020-06-22 | 0.25 | 0.34 | 0.43 | 0.65 |
| 2020-06-23 | 0.25 | 0.34 | 0.43 | 0.66 |
| 2020-06-24 | 0.25 | 0.34 | 0.43 | 0.61 |
| 2020-06-25 | 0.25 | 0.34 | 0.43 | 0.59 |
| 2020-06-26 | 0.25 | 0.34 | 0.43 | 0.55 |
| 2020-06-29 | 0.25 | 0.34 | 0.43 | 0.54 |
| 2020-06-30 | 0.25 | 0.34 | 0.43 | 0.51 |
| 2020-07-01 | 0.25 | 0.34 | 0.43 | 0.5 |
| 2020-07-02 | 0.25 | 0.34 | 0.43 | 0.51 |
| 2020-07-03 | 0.25 | 0.34 | 0.43 | 0.51 |
| 2020-07-07 | 0.25 | 0.34 | 0.43 | 0.51 |
| 2020-07-08 | 0.25 | 0.34 | 0.43 | 0.51 |
| 2020-07-09 | 0.25 | 0.34 | 0.43 | 0.51 |
| 2020-07-10 | 0.25 | 0.34 | 0.43 | 0.51 |
| 2020-07-13 | 0.25 | 0.34 | 0.43 | 0.6 |
| 2020-07-14 | 0.25 | 0.34 | 0.43 | 0.59 |
| 2020-07-15 | 0.25 | 0.34 | 0.43 | 0.61 |
| 2020-07-16 | 0.25 | 0.34 | 0.43 | 0.65 |
| 2020-07-17 | 0.25 | 0.34 | 0.43 | 0.68 |
| 2020-07-20 | 0.25 | 0.34 | 0.43 | 0.67 |
| 2020-07-21 | 0.25 | 0.34 | 0.43 | 0.65 |
| 2020-07-22 | 0.25 | 0.34 | 0.43 | 0.65 |
| 2020-07-23 | 0.25 | 0.34 | 0.43 | 0.65 |
| 2020-07-24 | 0.25 | 0.34 | 0.43 | 0.66 |
| 2020-07-27 | 0.25 | 0.34 | 0.43 | 0.67 |
| 2020-07-28 | 0.25 | 0.34 | 0.43 | 0.67 |
| 2020-07-29 | 0.25 | 0.34 | 0.43 | 0.67 |
| 2020-07-30 | 0.25 | 0.34 | 0.43 | 0.67 |
| 2020-07-31 | 0.25 | 0.34 | 0.43 | 0.67 |
| 2020-08-03 | 0.25 | 0.34 | 0.43 | 0.67 |
| 2020-08-04 | 0.25 | 0.34 | 0.43 | 0.68 |
| 2020-08-05 | 0.25 | 0.34 | 0.43 | 0.67 |
| 2020-08-06 | 0.25 | 0.34 | 0.43 | 0.67 |
| 2020-08-07 | 0.25 | 0.34 | 0.43 | 0.67 |
| 2020-08-10 | 0.25 | 0.34 | 0.43 | 0.67 |
| 2020-08-11 | 0.25 | 0.34 | 0.43 | 0.7 |
| 2020-08-12 | 0.25 | 0.34 | 0.43 | 0.77 |
| 2020-08-13 | 0.25 | 0.34 | 0.43 | 0.76 |
| 2020-08-14 | 0.25 | 0.34 | 0.43 | 0.76 |
| 2020-08-17 | 0.25 | 0.34 | 0.43 | 0.77 |
| 2020-08-18 | 0.25 | 0.34 | 0.43 | 0.81 |
| 2020-08-19 | 0.25 | 0.34 | 0.43 | 0.8 |
| 2020-08-20 | 0.25 | 0.34 | 0.43 | 0.78 |
| 2020-08-21 | 0.25 | 0.34 | 0.43 | 0.78 |
| 2020-08-24 | 0.25 | 0.34 | 0.43 | 0.78 |
| 2020-08-25 | 0.25 | 0.34 | 0.43 | 0.8 |
| 2020-08-26 | 0.25 | 0.34 | 0.43 | 0.87 |
| 2020-08-27 | 0.25 | 0.34 | 0.43 | 0.86 |
| 2020-08-28 | 0.25 | 0.34 | 0.43 | 0.89 |
| 2020-08-31 | 0.25 | 0.34 | 0.43 | 0.92 |
| 2020-09-01 | 0.25 | 0.34 | 0.43 | 0.91 |
| 2020-09-02 | 0.25 | 0.34 | 0.43 | 0.9 |
| 2020-09-03 | 0.25 | 0.34 | 0.43 | 0.84 |
| 2020-09-04 | 0.25 | 0.34 | 0.43 | 0.83 |
| 2020-09-07 | 0.25 | 0.34 | 0.43 | 0.84 |
| 2020-09-08 | 0.25 | 0.34 | 0.43 | 0.84 |
| 2020-09-09 | 0.25 | 0.34 | 0.43 | 0.84 |
| 2020-09-10 | 0.25 | 0.34 | 0.43 | 0.81 |
| 2020-09-11 | 0.25 | 0.34 | 0.43 | 0.79 |
| 2020-09-14 | 0.25 | 0.34 | 0.44 | 0.77 |
| 2020-09-15 | 0.25 | 0.34 | 0.44 | 0.77 |
| 2020-09-16 | 0.25 | 0.34 | 0.44 | 0.69 |
| 2020-09-17 | 0.25 | 0.34 | 0.44 | 0.69 |
| 2020-09-18 | 0.25 | 0.34 | 0.44 | 0.69 |
| 2020-09-21 | 0.25 | 0.34 | 0.44 | 0.66 |
| 2020-09-22 | 0.25 | 0.34 | 0.44 | 0.55 |
| 2020-09-23 | 0.25 | 0.34 | 0.44 | 0.58 |
| 2020-09-24 | 0.25 | 0.34 | 0.44 | 0.61 |
| 2020-09-25 | 0.25 | 0.34 | 0.44 | 0.63 |
| 2020-09-29 | 0.25 | 0.35 | 0.44 | 0.62 |
| 2020-09-30 | 0.25 | 0.35 | 0.44 | 0.59 |
| 2020-10-01 | 0.25 | 0.35 | 0.44 | 0.61 |
| 2020-10-02 | 0.25 | 0.35 | 0.44 | 0.61 |
| 2020-10-05 | 0.25 | 0.35 | 0.44 | 0.61 |
| 2020-10-06 | 0.25 | 0.35 | 0.44 | 0.67 |
| 2020-10-07 | 0.25 | 0.35 | 0.44 | 0.69 |
| 2020-10-08 | 0.25 | 0.35 | 0.44 | 0.65 |
| 2020-10-09 | 0.25 | 0.35 | 0.44 | 0.63 |
| 2020-10-12 | 0.25 | 0.35 | 0.43 | 0.62 |
| 2020-10-13 | 0.25 | 0.35 | 0.43 | 0.57 |
| 2020-10-14 | 0.25 | 0.35 | 0.43 | 0.59 |
| 2020-10-15 | 0.25 | 0.35 | 0.43 | 0.57 |
| 2020-10-16 | 0.25 | 0.35 | 0.43 | 0.58 |
| 2020-10-19 | 0.25 | 0.35 | 0.43 | 0.6 |
| 2020-10-20 | 0.25 | 0.35 | 0.43 | 0.6 |
| 2020-10-21 | 0.25 | 0.35 | 0.43 | 0.63 |
| 2020-10-22 | 0.25 | 0.35 | 0.43 | 0.62 |
| 2020-10-23 | 0.25 | 0.35 | 0.43 | 0.61 |
| 2020-10-26 | 0.25 | 0.35 | 0.43 | 0.59 |
| 2020-10-27 | 0.25 | 0.35 | 0.42 | 0.58 |
| 2020-10-29 | 0.25 | 0.35 | 0.42 | 0.58 |
| 2020-10-30 | 0.25 | 0.35 | 0.42 | 0.57 |